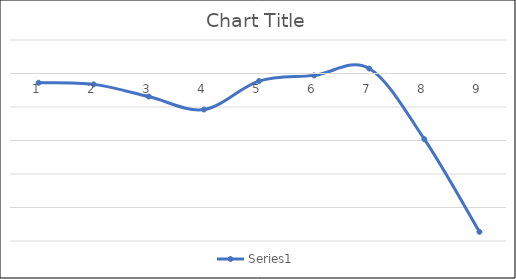
| Category | Series 0 |
|---|---|
| 0 | -1.382 |
| 1 | -1.623 |
| 2 | -3.439 |
| 3 | -5.379 |
| 4 | -1.129 |
| 5 | -0.281 |
| 6 | 0.741 |
| 7 | -9.804 |
| 8 | -23.632 |